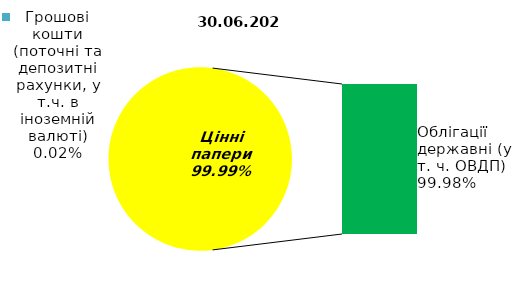
| Category | Series 0 |
|---|---|
| Грошові кошти (поточні та депозитні рахунки, у т.ч. в іноземній валюті) | 0.034 |
| Банківські метали | 0 |
| Нерухомість | 0 |
| Інші активи | 0 |
| Акції | 0 |
| Облігації підприємств | 0 |
| Муніципальні облігації | 0 |
| Облігації державні (у т. ч. ОВДП) | 157.177 |
| Іпотечні сертифікати | 0 |